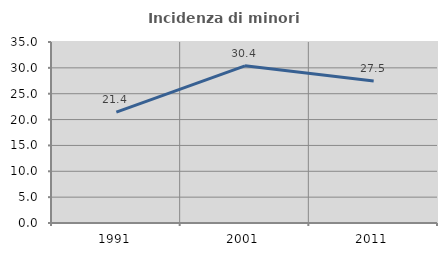
| Category | Incidenza di minori stranieri |
|---|---|
| 1991.0 | 21.429 |
| 2001.0 | 30.392 |
| 2011.0 | 27.451 |